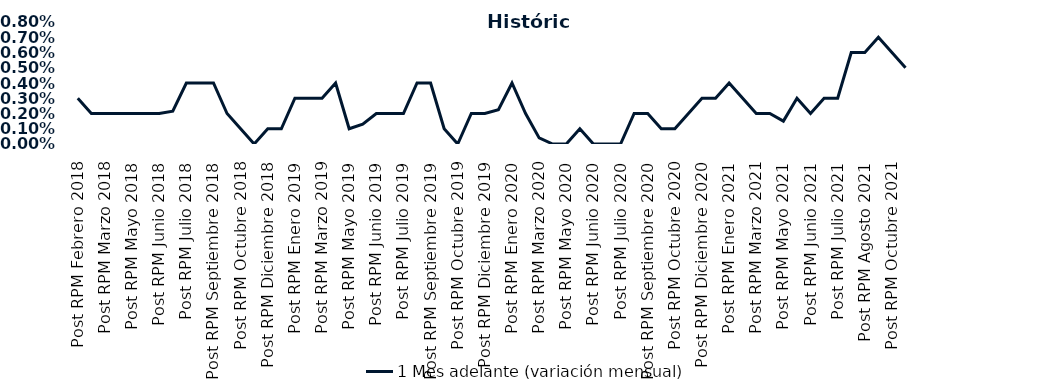
| Category | 1 Mes adelante (variación mensual) |
|---|---|
| Post RPM Febrero 2018 | 0.003 |
| Pre RPM Marzo 2018 | 0.002 |
| Post RPM Marzo 2018 | 0.002 |
| Pre RPM Mayo 2018 | 0.002 |
| Post RPM Mayo 2018 | 0.002 |
| Pre RPM Junio 2018 | 0.002 |
| Post RPM Junio 2018 | 0.002 |
| Pre RPM Julio 2018 | 0.002 |
| Post RPM Julio 2018 | 0.004 |
| Pre RPM Septiembre 2018 | 0.004 |
| Post RPM Septiembre 2018 | 0.004 |
| Pre RPM Octubre 2018 | 0.002 |
| Post RPM Octubre 2018 | 0.001 |
| Pre RPM Diciembre 2018 | 0 |
| Post RPM Diciembre 2018 | 0.001 |
| Pre RPM Enero 2019 | 0.001 |
| Post RPM Enero 2019 | 0.003 |
| Pre RPM Marzo 2019 | 0.003 |
| Post RPM Marzo 2019 | 0.003 |
| Pre RPM Mayo 2019 | 0.004 |
| Post RPM Mayo 2019 | 0.001 |
| Pre RPM Junio 2019 | 0.001 |
| Post RPM Junio 2019 | 0.002 |
| Pre RPM Julio 2019 | 0.002 |
| Post RPM Julio 2019 | 0.002 |
| Pre RPM Septiembre 2019 | 0.004 |
| Post RPM Septiembre 2019 | 0.004 |
| Pre RPM Octubre 2019 | 0.001 |
| Post RPM Octubre 2019 | 0 |
| Pre RPM Diciembre 2019 | 0.002 |
| Post RPM Diciembre 2019 | 0.002 |
| Pre RPM Enero 2020 | 0.002 |
| Post RPM Enero 2020 | 0.004 |
| Pre RPM Marzo 2020 | 0.002 |
| Post RPM Marzo 2020 | 0 |
| Pre RPM Mayo 2020 | 0 |
| Post RPM Mayo 2020 | 0 |
| Pre RPM Junio 2020 | 0.001 |
| Post RPM Junio 2020 | 0 |
| Pre RPM Julio 2020 | 0 |
| Post RPM Julio 2020 | 0 |
| Pre RPM Septiembre 2020 | 0.002 |
| Post RPM Septiembre 2020 | 0.002 |
| Pre RPM Octubre 2020 | 0.001 |
| Post RPM Octubre 2020 | 0.001 |
| Pre RPM Diciembre 2020 | 0.002 |
| Post RPM Diciembre 2020 | 0.003 |
| Pre RPM Enero 2021 | 0.003 |
| Post RPM Enero 2021 | 0.004 |
| Pre RPM Marzo 2021 | 0.003 |
| Post RPM Marzo 2021 | 0.002 |
| Pre RPM Mayo 2021 | 0.002 |
| Post RPM Mayo 2021 | 0.002 |
| Pre RPM Junio 2021 | 0.003 |
| Post RPM Junio 2021 | 0.002 |
| Pre RPM Julio 2021 | 0.003 |
| Post RPM Julio 2021 | 0.003 |
| Pre RPM Agosto 2021 | 0.006 |
| Post RPM Agosto 2021 | 0.006 |
| Pre RPM Octubre 2021 | 0.007 |
| Post RPM Octubre 2021 | 0.006 |
| Pre RPM Diciembre 2021 | 0.005 |